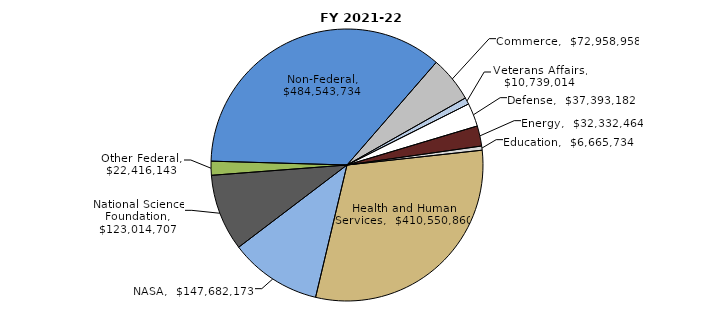
| Category | Series 0 |
|---|---|
| Commerce | 72958958 |
| Veterans Affairs | 10739014 |
| Defense | 37393182 |
| Energy | 32332464 |
| Education | 6665734 |
| Health and Human Services | 410550860 |
| NASA | 147682173 |
| National Science Foundation | 123014707 |
| Other Federal | 22416143 |
| Non-Federal | 484543734 |